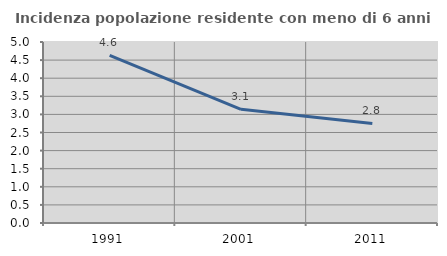
| Category | Incidenza popolazione residente con meno di 6 anni |
|---|---|
| 1991.0 | 4.631 |
| 2001.0 | 3.14 |
| 2011.0 | 2.75 |